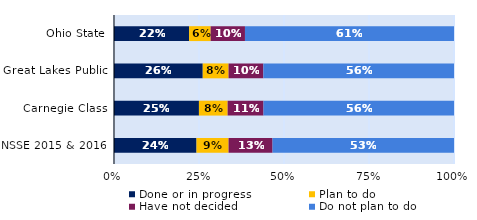
| Category | Done or in progress | Plan to do | Have not decided | Do not plan to do |
|---|---|---|---|---|
| Ohio State | 0.221 | 0.063 | 0.101 | 0.615 |
| Great Lakes Public | 0.261 | 0.076 | 0.102 | 0.561 |
| Carnegie Class | 0.25 | 0.084 | 0.105 | 0.56 |
| NSSE 2015 & 2016 | 0.243 | 0.094 | 0.129 | 0.534 |